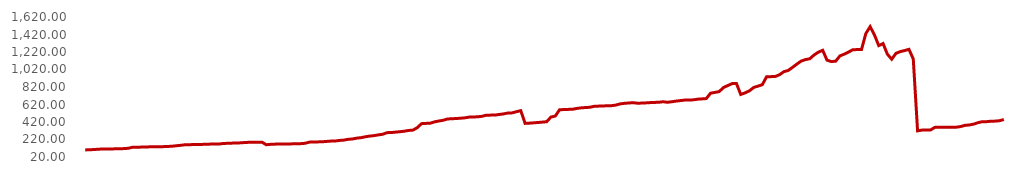
| Category | Series 0 |
|---|---|
| 4.0 | 100.68 |
| 22.0 | 103.02 |
| 41.0 | 105 |
| 69.0 | 108.81 |
| 102.0 | 111.39 |
| 108.0 | 112.15 |
| 110.0 | 112.34 |
| 111.0 | 113.11 |
| 120.0 | 114.49 |
| 130.0 | 115.92 |
| 159.0 | 119.88 |
| 180.0 | 131.79 |
| 203.0 | 132.63 |
| 212.0 | 132.88 |
| 243.0 | 135.24 |
| 249.0 | 135.88 |
| 252.0 | 136.22 |
| 253.0 | 136.35 |
| 284.0 | 138.12 |
| 306.0 | 140.43 |
| 320.0 | 142.46 |
| 356.0 | 147.68 |
| 386.0 | 152.78 |
| 419.0 | 158.9 |
| 423.0 | 160.05 |
| 435.0 | 162.24 |
| 449.0 | 163.82 |
| 451.0 | 163.95 |
| 472.0 | 165.16 |
| 492.0 | 167.36 |
| 499.0 | 167.99 |
| 504.0 | 168.45 |
| 529.0 | 174.01 |
| 549.0 | 176.58 |
| 562.0 | 178.37 |
| 572.0 | 180.31 |
| 573.0 | 181.59 |
| 602.0 | 185.55 |
| 620.0 | 187.92 |
| 626.0 | 188.32 |
| 636.0 | 189.03 |
| 642.0 | 189.67 |
| 649.0 | 160.08 |
| 665.0 | 164.85 |
| 681.0 | 167.05 |
| 687.0 | 167.92 |
| 689.0 | 168.44 |
| 692.0 | 168.9 |
| 711.0 | 170.17 |
| 718.0 | 171.17 |
| 728.0 | 172.71 |
| 734.0 | 176.75 |
| 758.0 | 189.87 |
| 764.0 | 192.15 |
| 766.0 | 192.71 |
| 768.0 | 194.12 |
| 777.0 | 198.17 |
| 790.0 | 201.92 |
| 792.0 | 202.88 |
| 811.0 | 209.3 |
| 813.0 | 213.13 |
| 823.0 | 222.41 |
| 825.0 | 226.06 |
| 835.0 | 235.93 |
| 841.0 | 241.09 |
| 858.0 | 251.66 |
| 861.0 | 258.88 |
| 863.0 | 264.52 |
| 867.0 | 273.18 |
| 877.0 | 279.94 |
| 897.0 | 298.35 |
| 899.0 | 299.75 |
| 905.0 | 304.41 |
| 908.0 | 309.18 |
| 913.0 | 314.62 |
| 915.0 | 323.45 |
| 919.0 | 327.33 |
| 925.0 | 355.39 |
| 936.0 | 401.25 |
| 937.0 | 404.13 |
| 939.0 | 405.98 |
| 953.0 | 421.39 |
| 959.0 | 431.37 |
| 961.0 | 439.66 |
| 972.0 | 454.45 |
| 975.0 | 457.33 |
| 979.0 | 459.72 |
| 982.0 | 463.16 |
| 987.0 | 467.34 |
| 996.0 | 475.64 |
| 998.0 | 477.42 |
| 1001.0 | 479.35 |
| 1003.0 | 485.05 |
| 1014.0 | 497.99 |
| 1015.0 | 498.57 |
| 1016.0 | 499.15 |
| 1025.0 | 506.08 |
| 1033.0 | 512.35 |
| 1034.0 | 522.43 |
| 1036.0 | 524.29 |
| 1039.0 | 537.89 |
| 1049.0 | 549.9 |
| 1066.0 | 404.11 |
| 1071.0 | 406.72 |
| 1081.0 | 410.41 |
| 1088.0 | 414.29 |
| 1092.0 | 418.75 |
| 1100.0 | 423.15 |
| 1108.0 | 476.85 |
| 1114.0 | 488 |
| 1131.0 | 559.99 |
| 1132.0 | 562.1 |
| 1140.0 | 564.13 |
| 1144.0 | 565.47 |
| 1153.0 | 575.3 |
| 1154.0 | 581.62 |
| 1157.0 | 585.39 |
| 1159.0 | 588.15 |
| 1170.0 | 599 |
| 1172.0 | 601.36 |
| 1178.0 | 603.2 |
| 1180.0 | 605.38 |
| 1183.0 | 606.23 |
| 1188.0 | 612.91 |
| 1199.0 | 626.54 |
| 1206.0 | 633.17 |
| 1210.0 | 637.21 |
| 1217.0 | 640.44 |
| 1232.0 | 635.24 |
| 1234.0 | 635.82 |
| 1236.0 | 638.5 |
| 1244.0 | 641.61 |
| 1251.0 | 643.79 |
| 1253.0 | 645.57 |
| 1265.0 | 651.51 |
| 1282.0 | 645.57 |
| 1294.0 | 651.53 |
| 1301.0 | 658.7 |
| 1303.0 | 664.46 |
| 1308.0 | 670.28 |
| 1310.0 | 671.74 |
| 1312.0 | 673.1 |
| 1316.0 | 680.84 |
| 1320.0 | 684.12 |
| 1329.0 | 687.61 |
| 1363.0 | 749.04 |
| 1365.0 | 758.14 |
| 1367.0 | 767.11 |
| 1369.0 | 814.39 |
| 1370.0 | 836.21 |
| 1372.0 | 858.8 |
| 1375.0 | 860.19 |
| 1378.0 | 735.19 |
| 1381.0 | 752.75 |
| 1383.0 | 775.94 |
| 1390.0 | 814.33 |
| 1401.0 | 830.27 |
| 1424.0 | 846.49 |
| 1426.0 | 937.59 |
| 1428.0 | 938.45 |
| 1435.0 | 940.3 |
| 1437.0 | 960.28 |
| 1440.0 | 995.35 |
| 1442.0 | 1009.01 |
| 1444.0 | 1044.18 |
| 1447.0 | 1081.36 |
| 1451.0 | 1116.14 |
| 1454.0 | 1133.22 |
| 1457.0 | 1142.56 |
| 1459.0 | 1185.82 |
| 1467.0 | 1218.18 |
| 1481.0 | 1239.5 |
| 1495.0 | 1127.19 |
| 1498.0 | 1110.65 |
| 1502.0 | 1114.86 |
| 1529.0 | 1175.64 |
| 1537.0 | 1195.52 |
| 1543.0 | 1219.26 |
| 1555.0 | 1246.84 |
| 1557.0 | 1247.24 |
| 1558.0 | 1248.55 |
| 1572.0 | 1430.67 |
| 1580.0 | 1509.59 |
| 1602.0 | 1415.39 |
| 1607.0 | 1292.87 |
| 1618.0 | 1316.73 |
| 1622.0 | 1194.74 |
| 1630.0 | 1137.38 |
| 1635.0 | 1205.04 |
| 1637.0 | 1224.63 |
| 1640.0 | 1236.6 |
| 1642.0 | 1250.67 |
| 1647.0 | 1140.62 |
| 1657.0 | 318.61 |
| 1665.0 | 327.26 |
| 1666.0 | 328.27 |
| 1672.0 | 328.63 |
| 1706.0 | 358.54 |
| 1707.0 | 359.75 |
| 1709.0 | 360.07 |
| 1710.0 | 360.36 |
| 1712.0 | 360.56 |
| 1714.0 | 360.9 |
| 1721.0 | 367.99 |
| 1748.0 | 382.13 |
| 1762.0 | 386.14 |
| 1795.0 | 395.67 |
| 1814.0 | 412.25 |
| 1836.0 | 423.56 |
| 1839.0 | 423.76 |
| 1854.0 | 428.83 |
| 1874.0 | 430.09 |
| 1899.0 | 434.51 |
| 1905.0 | 448.54 |